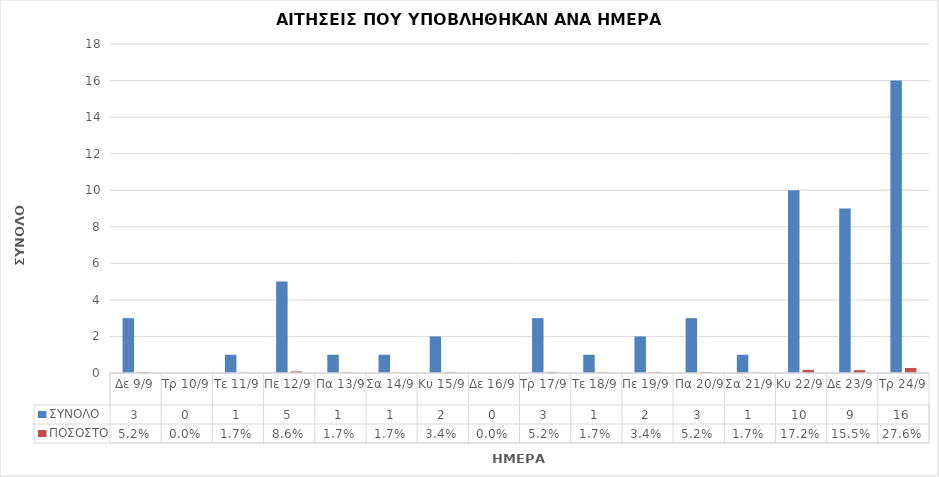
| Category | ΣΥΝΟΛΟ | ΠΟΣΟΣΤΟ |
|---|---|---|
| Δε 9/9 | 3 | 0.052 |
| Τρ 10/9 | 0 | 0 |
| Τε 11/9 | 1 | 0.017 |
| Πε 12/9 | 5 | 0.086 |
| Πα 13/9 | 1 | 0.017 |
| Σα 14/9 | 1 | 0.017 |
| Κυ 15/9 | 2 | 0.034 |
| Δε 16/9 | 0 | 0 |
| Τρ 17/9 | 3 | 0.052 |
| Τε 18/9 | 1 | 0.017 |
| Πε 19/9 | 2 | 0.034 |
| Πα 20/9 | 3 | 0.052 |
| Σα 21/9 | 1 | 0.017 |
| Κυ 22/9 | 10 | 0.172 |
| Δε 23/9 | 9 | 0.155 |
| Τρ 24/9 | 16 | 0.276 |